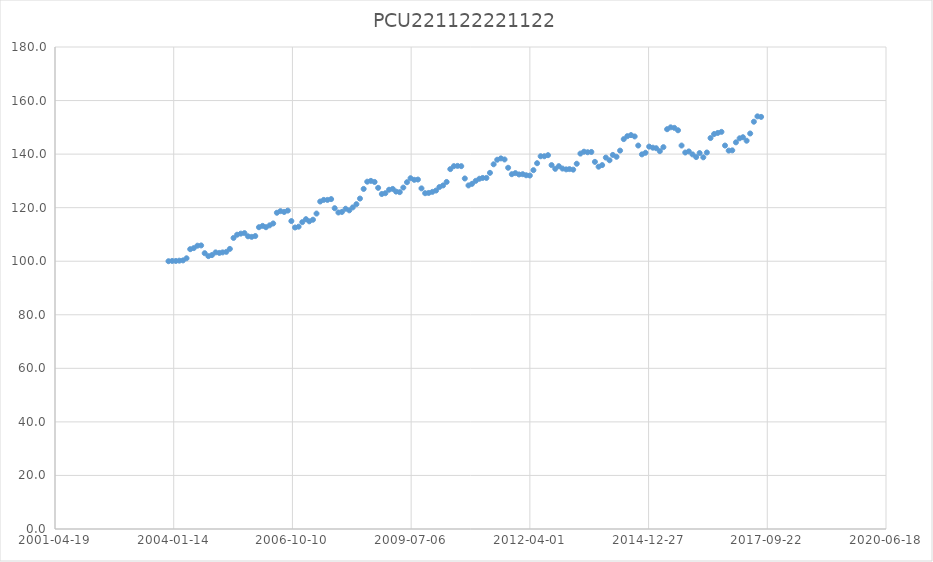
| Category | PCU221122221122 |
|---|---|
| 37956.0 | 100 |
| 37987.0 | 100.1 |
| 38018.0 | 100.1 |
| 38047.0 | 100.2 |
| 38078.0 | 100.3 |
| 38108.0 | 101.1 |
| 38139.0 | 104.5 |
| 38169.0 | 104.9 |
| 38200.0 | 105.8 |
| 38231.0 | 105.9 |
| 38261.0 | 103 |
| 38292.0 | 101.9 |
| 38322.0 | 102.3 |
| 38353.0 | 103.3 |
| 38384.0 | 103.1 |
| 38412.0 | 103.3 |
| 38443.0 | 103.5 |
| 38473.0 | 104.6 |
| 38504.0 | 108.7 |
| 38534.0 | 109.9 |
| 38565.0 | 110.3 |
| 38596.0 | 110.5 |
| 38626.0 | 109.3 |
| 38657.0 | 109.1 |
| 38687.0 | 109.4 |
| 38718.0 | 112.7 |
| 38749.0 | 113.2 |
| 38777.0 | 112.7 |
| 38808.0 | 113.4 |
| 38838.0 | 114.1 |
| 38869.0 | 118.1 |
| 38899.0 | 118.7 |
| 38930.0 | 118.4 |
| 38961.0 | 118.9 |
| 38991.0 | 115 |
| 39022.0 | 112.6 |
| 39052.0 | 112.9 |
| 39083.0 | 114.6 |
| 39114.0 | 115.7 |
| 39142.0 | 114.9 |
| 39173.0 | 115.5 |
| 39203.0 | 117.8 |
| 39234.0 | 122.3 |
| 39264.0 | 122.9 |
| 39295.0 | 122.9 |
| 39326.0 | 123.2 |
| 39356.0 | 119.8 |
| 39387.0 | 118.2 |
| 39417.0 | 118.4 |
| 39448.0 | 119.6 |
| 39479.0 | 119 |
| 39508.0 | 120.1 |
| 39539.0 | 121.3 |
| 39569.0 | 123.4 |
| 39600.0 | 127 |
| 39630.0 | 129.7 |
| 39661.0 | 130 |
| 39692.0 | 129.6 |
| 39722.0 | 127.4 |
| 39753.0 | 125.1 |
| 39783.0 | 125.4 |
| 39814.0 | 126.7 |
| 39845.0 | 127 |
| 39873.0 | 126 |
| 39904.0 | 125.8 |
| 39934.0 | 127.5 |
| 39965.0 | 129.5 |
| 39995.0 | 131 |
| 40026.0 | 130.4 |
| 40057.0 | 130.5 |
| 40087.0 | 127.2 |
| 40118.0 | 125.4 |
| 40148.0 | 125.5 |
| 40179.0 | 125.9 |
| 40210.0 | 126.4 |
| 40238.0 | 127.7 |
| 40269.0 | 128.3 |
| 40299.0 | 129.6 |
| 40330.0 | 134.4 |
| 40360.0 | 135.5 |
| 40391.0 | 135.6 |
| 40422.0 | 135.5 |
| 40452.0 | 130.9 |
| 40483.0 | 128.3 |
| 40513.0 | 128.9 |
| 40544.0 | 130 |
| 40575.0 | 130.8 |
| 40603.0 | 131.1 |
| 40634.0 | 131.1 |
| 40664.0 | 133 |
| 40695.0 | 136.2 |
| 40725.0 | 137.9 |
| 40756.0 | 138.4 |
| 40787.0 | 138 |
| 40817.0 | 134.9 |
| 40848.0 | 132.5 |
| 40878.0 | 132.9 |
| 40909.0 | 132.4 |
| 40940.0 | 132.5 |
| 40969.0 | 132.1 |
| 41000.0 | 132 |
| 41030.0 | 134 |
| 41061.0 | 136.6 |
| 41091.0 | 139.2 |
| 41122.0 | 139.2 |
| 41153.0 | 139.6 |
| 41183.0 | 135.9 |
| 41214.0 | 134.5 |
| 41244.0 | 135.5 |
| 41275.0 | 134.6 |
| 41306.0 | 134.3 |
| 41334.0 | 134.4 |
| 41365.0 | 134.2 |
| 41395.0 | 136.4 |
| 41426.0 | 140.2 |
| 41456.0 | 140.9 |
| 41487.0 | 140.7 |
| 41518.0 | 140.8 |
| 41548.0 | 137.1 |
| 41579.0 | 135.3 |
| 41609.0 | 135.9 |
| 41640.0 | 138.7 |
| 41671.0 | 137.7 |
| 41699.0 | 139.7 |
| 41730.0 | 139 |
| 41760.0 | 141.3 |
| 41791.0 | 145.6 |
| 41821.0 | 146.7 |
| 41852.0 | 147.1 |
| 41883.0 | 146.6 |
| 41913.0 | 143.2 |
| 41944.0 | 139.9 |
| 41974.0 | 140.5 |
| 42005.0 | 142.8 |
| 42036.0 | 142.4 |
| 42064.0 | 142.2 |
| 42095.0 | 141.1 |
| 42125.0 | 142.6 |
| 42156.0 | 149.3 |
| 42186.0 | 150 |
| 42217.0 | 149.8 |
| 42248.0 | 148.9 |
| 42278.0 | 143.2 |
| 42309.0 | 140.6 |
| 42339.0 | 141 |
| 42370.0 | 139.9 |
| 42401.0 | 138.9 |
| 42430.0 | 140.4 |
| 42461.0 | 138.8 |
| 42491.0 | 140.6 |
| 42522.0 | 146 |
| 42552.0 | 147.5 |
| 42583.0 | 147.9 |
| 42614.0 | 148.3 |
| 42644.0 | 143.2 |
| 42675.0 | 141.3 |
| 42705.0 | 141.4 |
| 42736.0 | 144.4 |
| 42767.0 | 145.9 |
| 42795.0 | 146.3 |
| 42826.0 | 145 |
| 42856.0 | 147.7 |
| 42887.0 | 152.1 |
| 42917.0 | 154.1 |
| 42948.0 | 153.9 |